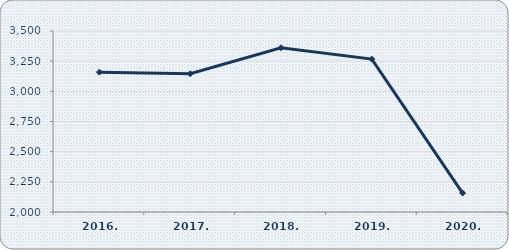
| Category | Broj zaposlenih |
|---|---|
| 2016. | 3159 |
| 2017. | 3146 |
| 2018. | 3361 |
| 2019. | 3267 |
| 2020. | 2157 |